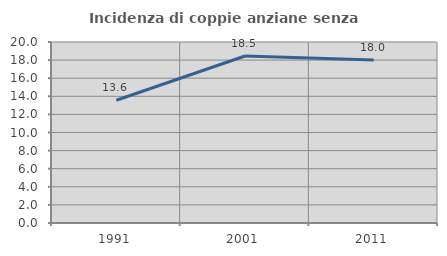
| Category | Incidenza di coppie anziane senza figli  |
|---|---|
| 1991.0 | 13.559 |
| 2001.0 | 18.456 |
| 2011.0 | 18.004 |